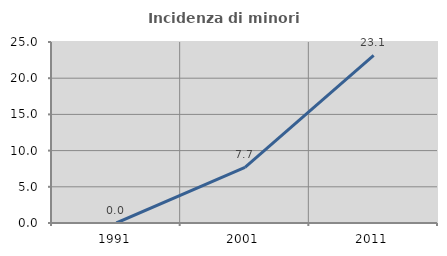
| Category | Incidenza di minori stranieri |
|---|---|
| 1991.0 | 0 |
| 2001.0 | 7.692 |
| 2011.0 | 23.148 |